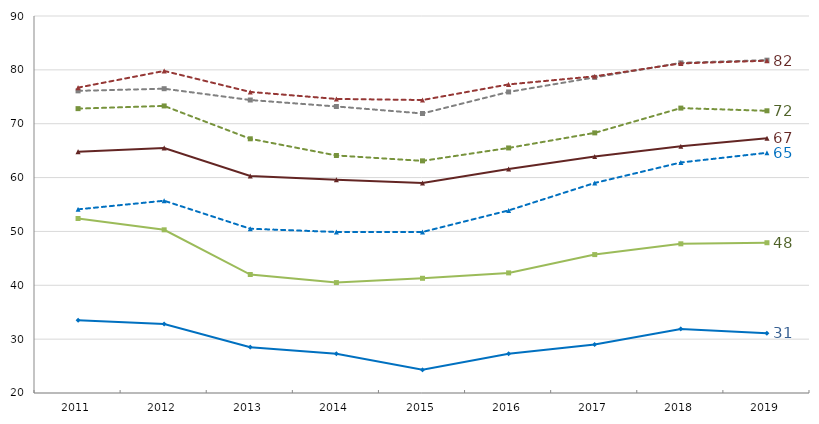
| Category | CAP - Scolaire | Bac pro - Scolaire | BTS - Scolaire | CAP - Apprentissage | BP - Apprentissage | Bac pro - Apprentissage | BTS - Apprentissage |
|---|---|---|---|---|---|---|---|
| 2011.0 | 33.5 | 52.4 | 64.8 | 54.1 | 76.1 | 72.8 | 76.7 |
| 2012.0 | 32.8 | 50.3 | 65.5 | 55.7 | 76.5 | 73.3 | 79.8 |
| 2013.0 | 28.5 | 42 | 60.3 | 50.5 | 74.4 | 67.2 | 75.9 |
| 2014.0 | 27.3 | 40.5 | 59.6 | 49.9 | 73.2 | 64.1 | 74.6 |
| 2015.0 | 24.3 | 41.3 | 59 | 49.9 | 71.9 | 63.1 | 74.4 |
| 2016.0 | 27.3 | 42.3 | 61.6 | 53.9 | 75.9 | 65.5 | 77.3 |
| 2017.0 | 29 | 45.7 | 63.9 | 59 | 78.6 | 68.3 | 78.8 |
| 2018.0 | 31.9 | 47.7 | 65.8 | 62.8 | 81.3 | 72.9 | 81.2 |
| 2019.0 | 31.1 | 47.9 | 67.3 | 64.6 | 81.8 | 72.4 | 81.7 |